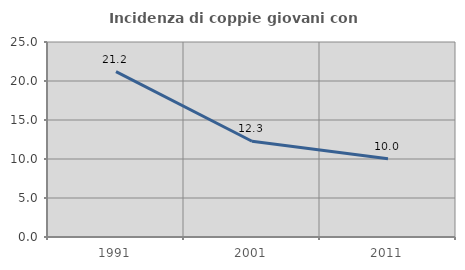
| Category | Incidenza di coppie giovani con figli |
|---|---|
| 1991.0 | 21.199 |
| 2001.0 | 12.28 |
| 2011.0 | 10.031 |